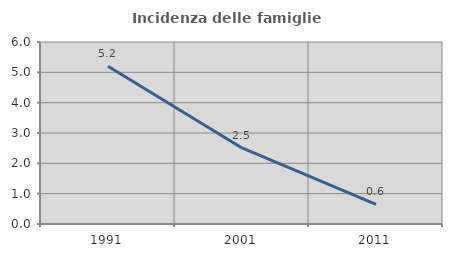
| Category | Incidenza delle famiglie numerose |
|---|---|
| 1991.0 | 5.199 |
| 2001.0 | 2.508 |
| 2011.0 | 0.643 |